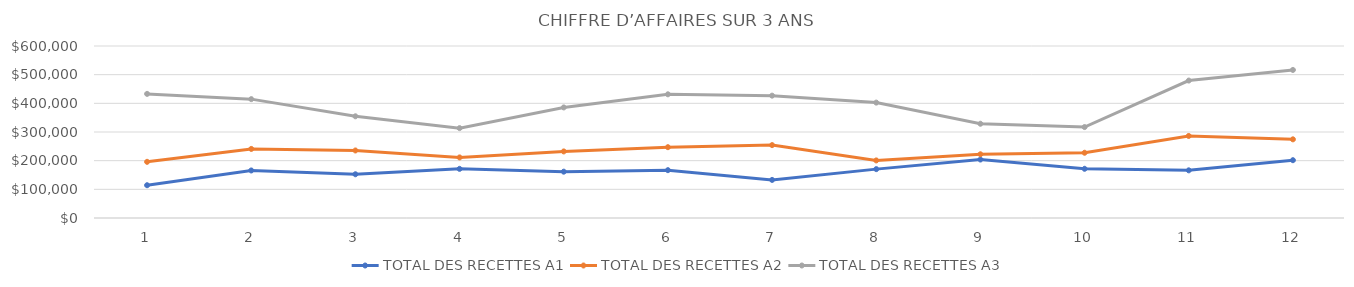
| Category | TOTAL DES RECETTES A1 | TOTAL DES RECETTES A2 | TOTAL DES RECETTES A3 |
|---|---|---|---|
| 0 | 114350 | 195956 | 432976 |
| 1 | 165800 | 240945 | 414652 |
| 2 | 152557 | 235555 | 354787 |
| 3 | 171421 | 211305 | 313504 |
| 4 | 161618 | 232213 | 385676 |
| 5 | 166870 | 247021 | 431520 |
| 6 | 132884 | 254266 | 426803 |
| 7 | 170481 | 200836 | 402533 |
| 8 | 203968 | 222280 | 328813 |
| 9 | 171681 | 227616 | 317269 |
| 10 | 166247 | 286221 | 479413 |
| 11 | 201651 | 274416 | 516463 |